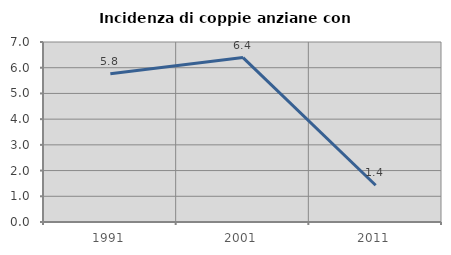
| Category | Incidenza di coppie anziane con figli |
|---|---|
| 1991.0 | 5.769 |
| 2001.0 | 6.395 |
| 2011.0 | 1.429 |